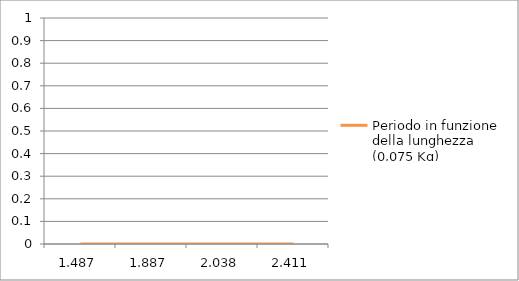
| Category | Periodo in funzione della lunghezza (0,075 Kg) |
|---|---|
| 1.487 | 0 |
| 1.887 | 0 |
| 2.038 | 0 |
| 2.411 | 0 |